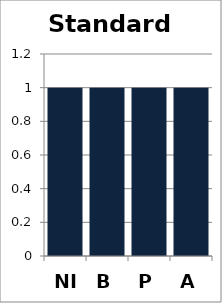
| Category | Standard 1 |
|---|---|
| NI | 1 |
| B | 1 |
| P | 1 |
| A | 1 |